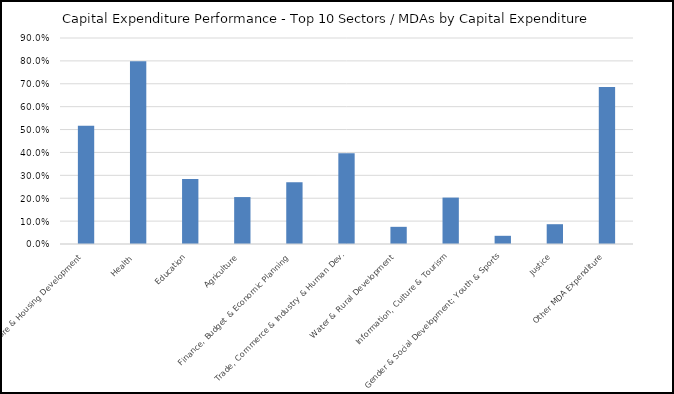
| Category | Series 0 |
|---|---|
| Infrastructure & Housing Development | 0.517 |
| Health  | 0.798 |
| Education | 0.284 |
| Agriculture | 0.205 |
| Finance, Budget & Economic Planning  | 0.27 |
| Trade, Commerce & Industry & Human Dev. | 0.396 |
| Water & Rural Development  | 0.075 |
| Information, Culture & Tourism | 0.203 |
| Gender & Social Development; Youth & Sports | 0.036 |
| Justice | 0.086 |
| Other MDA Expenditure | 0.686 |